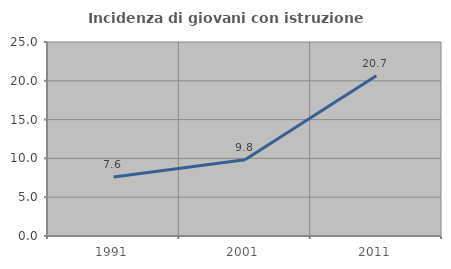
| Category | Incidenza di giovani con istruzione universitaria |
|---|---|
| 1991.0 | 7.598 |
| 2001.0 | 9.827 |
| 2011.0 | 20.659 |